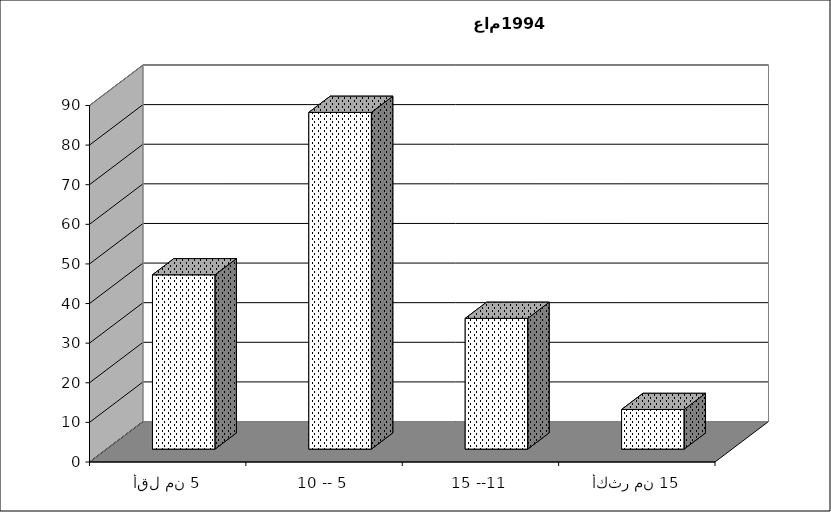
| Category | Series 0 |
|---|---|
| أقل من 5 | 44 |
| 10 -- 5 | 85 |
| 15 --11 | 33 |
| أكثر من 15 | 10 |